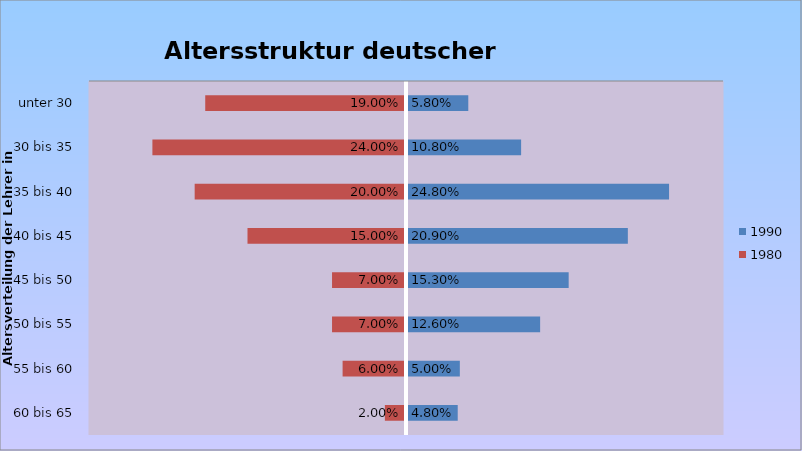
| Category | 1990 | 1980 |
|---|---|---|
| unter 30 | 0.058 | -0.19 |
| 30 bis 35 | 0.108 | -0.24 |
| 35 bis 40 | 0.248 | -0.2 |
| 40 bis 45 | 0.209 | -0.15 |
| 45 bis 50 | 0.153 | -0.07 |
| 50 bis 55 | 0.126 | -0.07 |
| 55 bis 60 | 0.05 | -0.06 |
| 60 bis 65 | 0.048 | -0.02 |